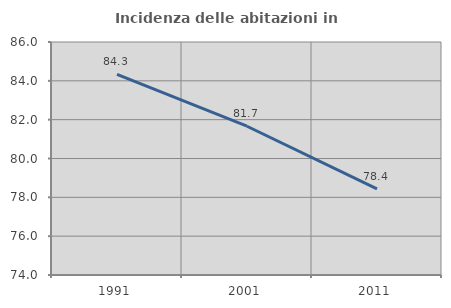
| Category | Incidenza delle abitazioni in proprietà  |
|---|---|
| 1991.0 | 84.332 |
| 2001.0 | 81.662 |
| 2011.0 | 78.435 |